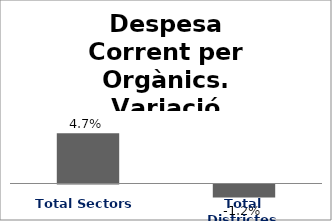
| Category | Series 0 |
|---|---|
| Total Sectors | 0.047 |
| Total Districtes | -0.012 |